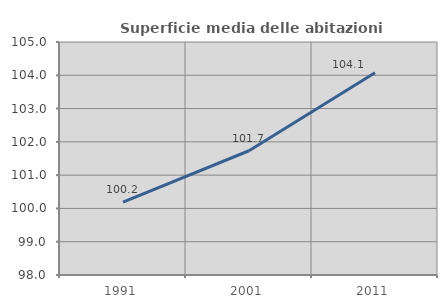
| Category | Superficie media delle abitazioni occupate |
|---|---|
| 1991.0 | 100.189 |
| 2001.0 | 101.733 |
| 2011.0 | 104.078 |